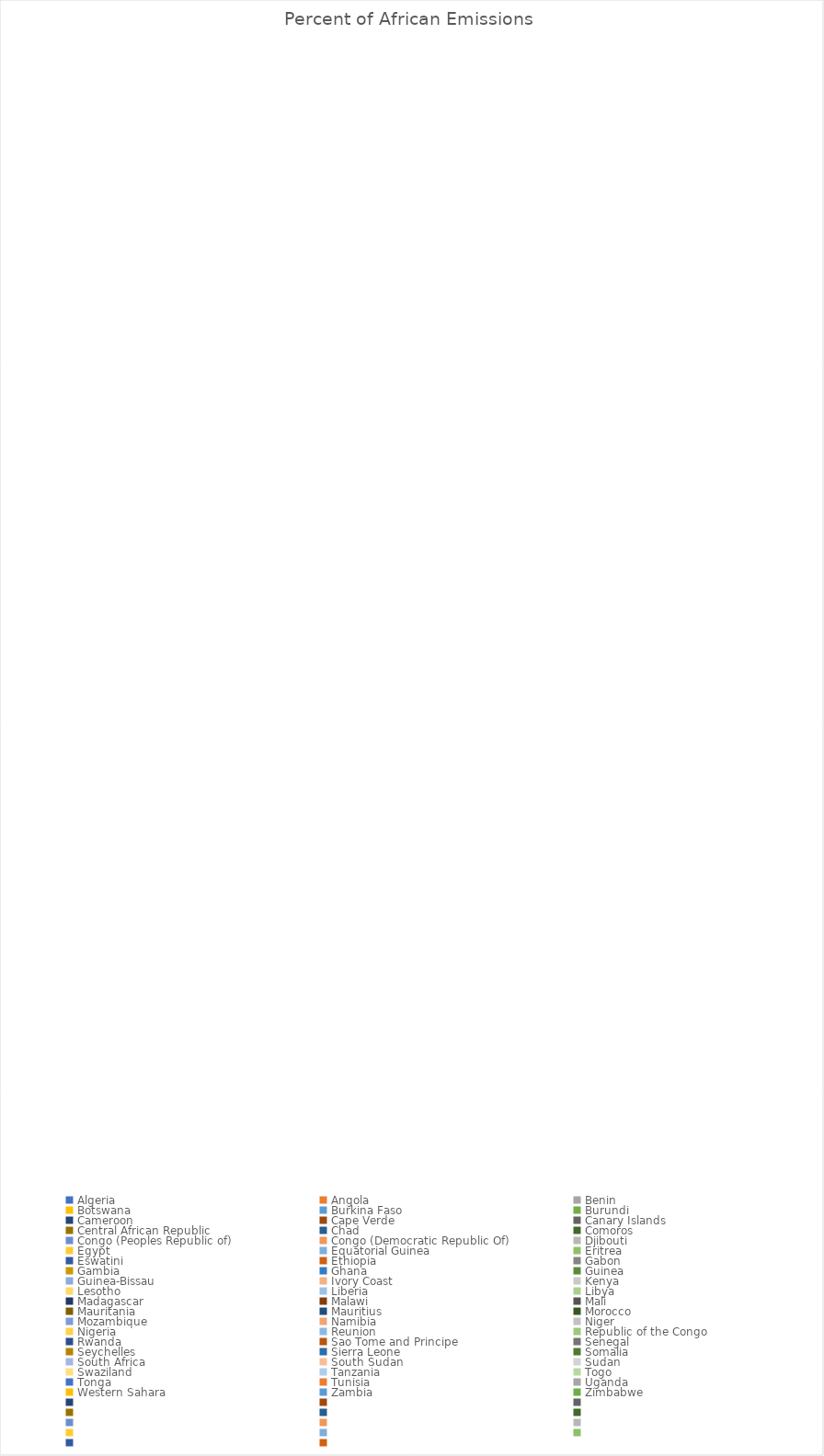
| Category | Percent of African Emissions  |
|---|---|
| Algeria | 0 |
| Angola | 0 |
| Benin | 0 |
| Botswana | 0 |
| Burkina Faso | 0 |
| Burundi | 0 |
| Cameroon | 0 |
| Cape Verde | 0 |
| Canary Islands | 0 |
| Central African Republic | 0 |
| Chad | 0 |
| Comoros | 0 |
| Congo (Peoples Republic of) | 0 |
| Congo (Democratic Republic Of) | 0 |
| Djibouti | 0 |
| Egypt | 0 |
| Equatorial Guinea | 0 |
| Eritrea | 0 |
| Eswatini | 0 |
| Ethiopia | 0 |
| Gabon | 0 |
| Gambia | 0 |
| Ghana | 0 |
| Guinea | 0 |
| Guinea-Bissau | 0 |
| Ivory Coast | 0 |
| Kenya | 0 |
| Lesotho | 0 |
| Liberia | 0 |
| Libya | 0 |
| Madagascar | 0 |
| Malawi | 0 |
| Mali | 0 |
| Mauritania | 0 |
| Mauritius | 0 |
| Morocco | 0 |
| Mozambique | 0 |
| Namibia | 0 |
| Niger | 0 |
| Nigeria | 0 |
| Reunion | 0 |
| Republic of the Congo | 0 |
| Rwanda | 0 |
| Sao Tome and Principe | 0 |
| Senegal | 0 |
| Seychelles | 0 |
| Sierra Leone | 0 |
| Somalia | 0 |
| South Africa | 0 |
| South Sudan | 0 |
| Sudan | 0 |
| Swaziland | 0 |
| Tanzania | 0 |
| Togo | 0 |
| Tonga | 0 |
| Tunisia | 0 |
| Uganda | 0 |
| Western Sahara | 0 |
| Zambia | 0 |
| Zimbabwe | 0 |